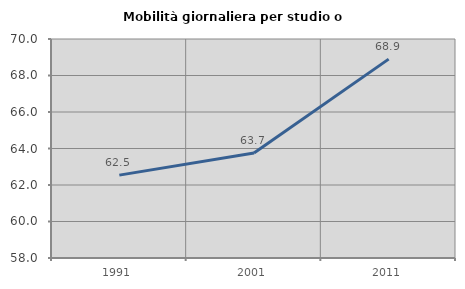
| Category | Mobilità giornaliera per studio o lavoro |
|---|---|
| 1991.0 | 62.541 |
| 2001.0 | 63.749 |
| 2011.0 | 68.897 |